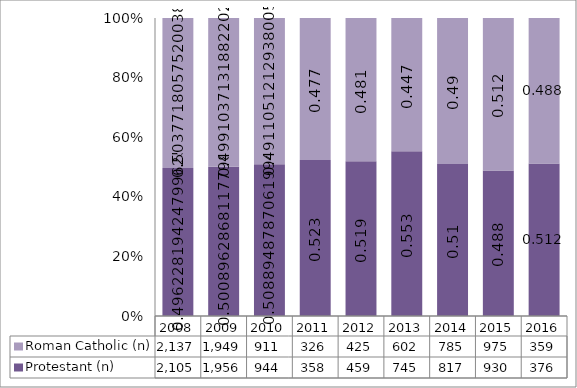
| Category | Protestant (n) | Roman Catholic (n) |
|---|---|---|
| 2008.0 | 2105 | 2137 |
| 2009.0 | 1956 | 1949 |
| 2010.0 | 944 | 911 |
| 2011.0 | 358 | 326 |
| 2012.0 | 459 | 425 |
| 2013.0 | 745 | 602 |
| 2014.0 | 817 | 785 |
| 2015.0 | 930 | 975 |
| 2016.0 | 376 | 359 |